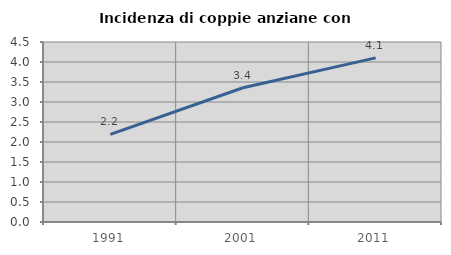
| Category | Incidenza di coppie anziane con figli |
|---|---|
| 1991.0 | 2.192 |
| 2001.0 | 3.356 |
| 2011.0 | 4.104 |